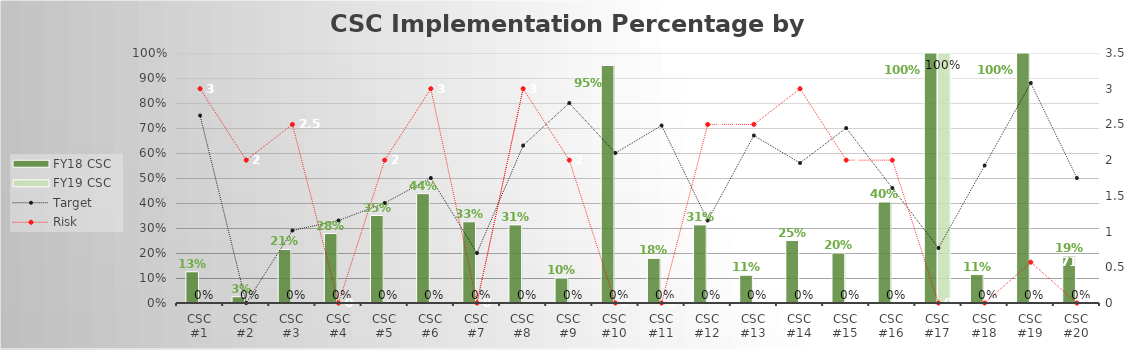
| Category | FY18 CSC | FY19 CSC  |
|---|---|---|
| CSC #1 | 0.125 | 0 |
| CSC #2 | 0.025 | 0 |
| CSC #3 | 0.214 | 0 |
| CSC #4 | 0.278 | 0 |
| CSC #5 | 0.35 | 0 |
| CSC #6 | 0.438 | 0 |
| CSC #7 | 0.325 | 0 |
| CSC #8 | 0.312 | 0 |
| CSC #9 | 0.1 | 0 |
| CSC #10 | 0.95 | 0 |
| CSC #11 | 0.179 | 0 |
| CSC #12 | 0.312 | 0 |
| CSC #13 | 0.111 | 0 |
| CSC #14 | 0.25 | 0 |
| CSC #15 | 0.2 | 0 |
| CSC #16 | 0.404 | 0 |
| CSC #17 | 1 | 1 |
| CSC #18 | 0.114 | 0 |
| CSC #19 | 1 | 0 |
| CSC #20 | 0.188 | 0 |